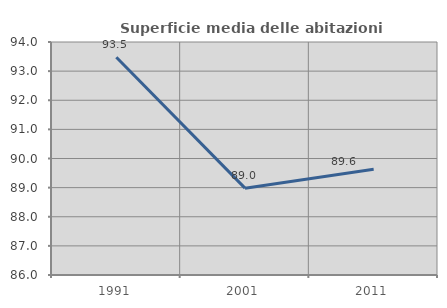
| Category | Superficie media delle abitazioni occupate |
|---|---|
| 1991.0 | 93.476 |
| 2001.0 | 88.981 |
| 2011.0 | 89.63 |